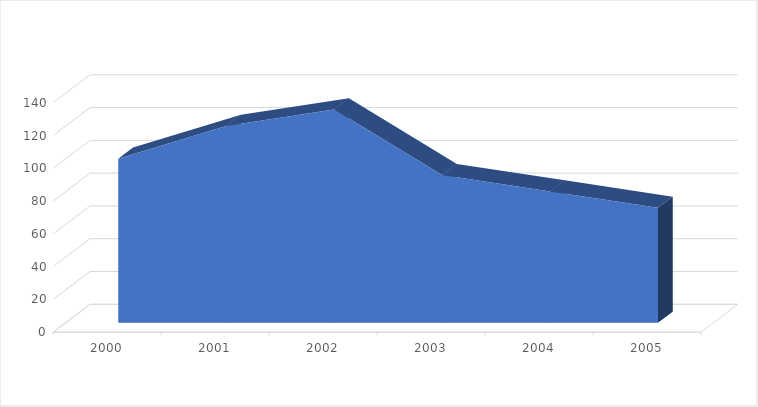
| Category | A |
|---|---|
| 2000 | 100 |
| 2001 | 120 |
| 2002 | 130 |
| 2003 | 90 |
| 2004 | 80 |
| 2005 | 70 |